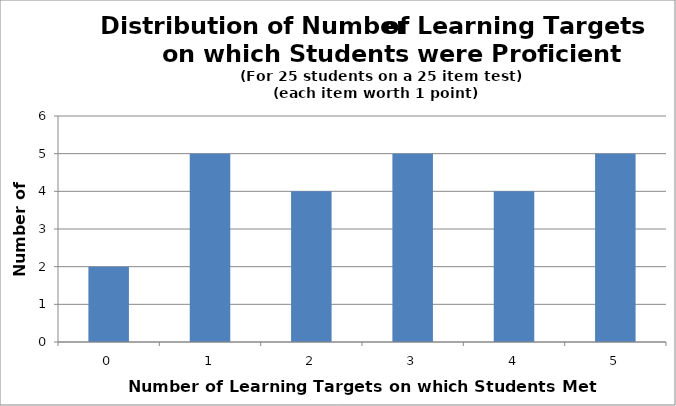
| Category | Prof |
|---|---|
| 0.0 | 2 |
| 1.0 | 5 |
| 2.0 | 4 |
| 3.0 | 5 |
| 4.0 | 4 |
| 5.0 | 5 |